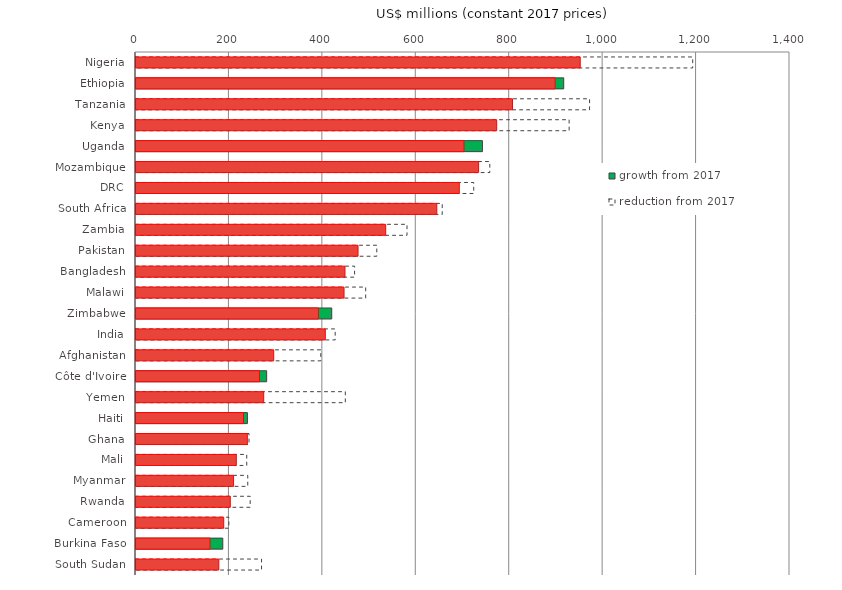
| Category | growth from 2017 | reduction from 2017 | Series 0 |
|---|---|---|---|
| Nigeria | 0 | 1191.735 | 950.962 |
| Ethiopia | 915.63 | 0 | 897.178 |
| Tanzania | 0 | 970.934 | 805.977 |
| Kenya | 0 | 927.205 | 772.161 |
| Uganda | 741.606 | 0 | 702.187 |
| Mozambique | 0 | 757.389 | 733.424 |
| DRC | 0 | 722.977 | 692.095 |
| South Africa | 0 | 655.535 | 643.92 |
| Zambia | 0 | 580.183 | 534.524 |
| Pakistan | 0 | 515.452 | 475.305 |
| Bangladesh | 0 | 467.944 | 447.342 |
| Malawi | 0 | 491.711 | 445.353 |
| Zimbabwe | 419.019 | 0 | 390.548 |
| India | 0 | 426.372 | 405.213 |
| Afghanistan | 0 | 395.623 | 294.811 |
| Côte d'Ivoire | 279.696 | 0 | 264.296 |
| Yemen | 0 | 448.064 | 273.404 |
| Haiti | 238.478 | 0 | 230.145 |
| Ghana | 0 | 241.895 | 238.324 |
| Mali | 0 | 237.056 | 214.732 |
| Myanmar | 0 | 239.225 | 208.881 |
| Rwanda | 0 | 244.433 | 201.88 |
| Cameroon | 0 | 198.758 | 187.827 |
| Burkina Faso | 185.782 | 0 | 158.431 |
| South Sudan | 0 | 268.752 | 177.3 |